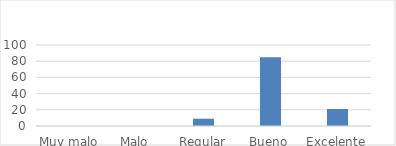
| Category | Series 0 |
|---|---|
| Muy malo | 0 |
| Malo | 0 |
| Regular | 9 |
| Bueno | 85 |
| Excelente | 21 |